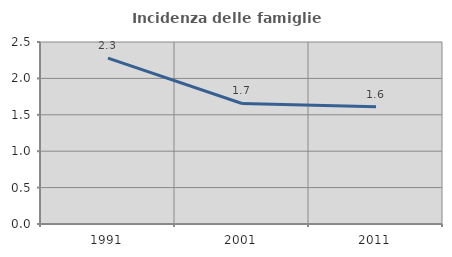
| Category | Incidenza delle famiglie numerose |
|---|---|
| 1991.0 | 2.278 |
| 2001.0 | 1.656 |
| 2011.0 | 1.611 |